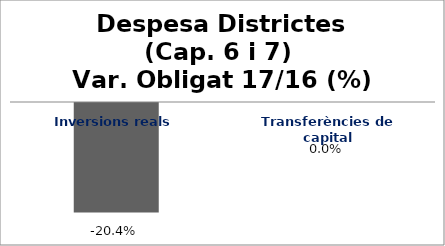
| Category | Series 0 |
|---|---|
| Inversions reals | -0.204 |
| Transferències de capital | 0 |